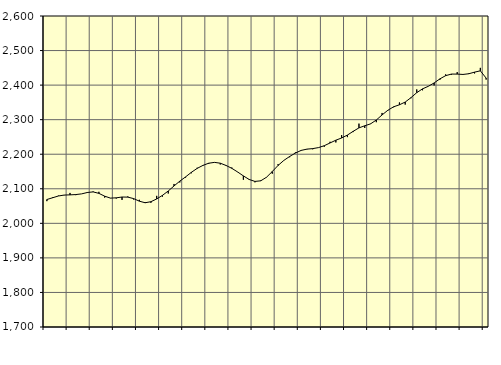
| Category | Piggar | Series 1 |
|---|---|---|
| nan | 2064.2 | 2068.97 |
| 1.0 | 2075.7 | 2074.08 |
| 1.0 | 2080.1 | 2079.1 |
| 1.0 | 2081.3 | 2081.82 |
| nan | 2088 | 2082.37 |
| 2.0 | 2081.6 | 2083.22 |
| 2.0 | 2085.2 | 2085.21 |
| 2.0 | 2087.8 | 2089.26 |
| nan | 2092.3 | 2090.95 |
| 3.0 | 2091.2 | 2086.73 |
| 3.0 | 2074.5 | 2078.58 |
| 3.0 | 2073.4 | 2072.97 |
| nan | 2071.7 | 2073.81 |
| 4.0 | 2067.8 | 2076.16 |
| 4.0 | 2077.8 | 2075.81 |
| 4.0 | 2069 | 2071.62 |
| nan | 2068.1 | 2064.11 |
| 5.0 | 2061.7 | 2059.54 |
| 5.0 | 2059.4 | 2062.64 |
| 5.0 | 2079.5 | 2070.58 |
| nan | 2077.3 | 2080.96 |
| 6.0 | 2086.3 | 2093.64 |
| 6.0 | 2113.9 | 2108.18 |
| 6.0 | 2118.3 | 2122.1 |
| nan | 2132.4 | 2134.39 |
| 7.0 | 2144.9 | 2147.58 |
| 7.0 | 2160.8 | 2158.97 |
| 7.0 | 2166.4 | 2167.66 |
| nan | 2171.9 | 2174.01 |
| 8.0 | 2176.8 | 2176.4 |
| 8.0 | 2170.3 | 2174.03 |
| 8.0 | 2168.4 | 2167.47 |
| nan | 2161.4 | 2159.15 |
| 9.0 | 2148.3 | 2148.66 |
| 9.0 | 2126.1 | 2137.26 |
| 9.0 | 2128 | 2126.98 |
| nan | 2118.7 | 2121.29 |
| 10.0 | 2124.3 | 2123.04 |
| 10.0 | 2133.9 | 2133.37 |
| 10.0 | 2143.7 | 2149.94 |
| nan | 2171.2 | 2167.47 |
| 11.0 | 2181.9 | 2182.09 |
| 11.0 | 2191.3 | 2193.44 |
| 11.0 | 2205.3 | 2203.34 |
| nan | 2210 | 2211.07 |
| 12.0 | 2214.2 | 2214.77 |
| 12.0 | 2214.3 | 2216.24 |
| 12.0 | 2218.9 | 2219.17 |
| nan | 2221.7 | 2224.67 |
| 13.0 | 2236 | 2232.63 |
| 13.0 | 2234.1 | 2240.58 |
| 13.0 | 2255.3 | 2247.01 |
| nan | 2249.5 | 2255.43 |
| 14.0 | 2264.1 | 2266.27 |
| 14.0 | 2288.5 | 2276.29 |
| 14.0 | 2276 | 2282.31 |
| nan | 2288.4 | 2287.79 |
| 15.0 | 2292.7 | 2298.96 |
| 15.0 | 2319.4 | 2313.71 |
| 15.0 | 2326 | 2327.27 |
| nan | 2335.9 | 2337.31 |
| 16.0 | 2349.8 | 2343.06 |
| 16.0 | 2343.6 | 2350.9 |
| 16.0 | 2362 | 2363.72 |
| nan | 2387.5 | 2378.13 |
| 17.0 | 2385 | 2389.17 |
| 17.0 | 2396.3 | 2396.6 |
| 17.0 | 2399 | 2406.24 |
| nan | 2415.4 | 2418.09 |
| 18.0 | 2431.1 | 2427.35 |
| 18.0 | 2430.1 | 2431.94 |
| 18.0 | 2437.6 | 2431.87 |
| nan | 2430.8 | 2430.86 |
| 19.0 | 2434.2 | 2432.87 |
| 19.0 | 2433.8 | 2437.56 |
| 19.0 | 2449.9 | 2441.33 |
| nan | 2416.1 | 2420.43 |